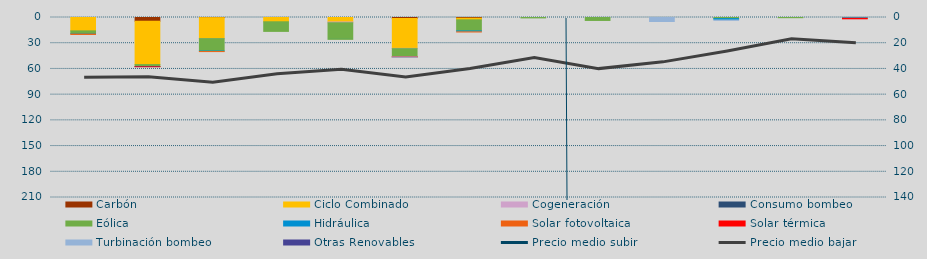
| Category | Carbón | Ciclo Combinado | Cogeneración | Consumo bombeo | Eólica | Hidráulica | Solar fotovoltaica | Solar térmica | Turbinación bombeo | Otras Renovables |
|---|---|---|---|---|---|---|---|---|---|---|
| 0 | 0 | 15599.6 | 0 |  | 3217.5 | 555 | 406.6 | 0 | 0 | 0 |
| 1 | 4394.5 | 50553 | 0 |  | 2251 | 0 | 33.2 | 196 | 0 | 467 |
| 2 | 167 | 24469.7 | 4.5 |  | 14472.2 | 627.8 | 21.8 | 0 | 0 | 0 |
| 3 | 0 | 4989.5 | 0 |  | 11218.3 | 8.9 | 0 | 0 | 0 | 0 |
| 4 | 0 | 5246.6 | 891.5 |  | 19357.7 | 73 | 0 | 0 | 0 | 0 |
| 5 | 1161 | 34847 | 340.9 |  | 9473.4 | 120 | 21.4 | 39.8 | 400 | 0 |
| 6 | 846 | 1898.8 | 0 |  | 12932.4 | 1173 | 33 | 0 | 0 | 80 |
| 7 | 0 | 0 | 0 |  | 464.6 | 0 | 0 | 0 | 0 | 0 |
| 8 | 0 | 0 | 0 |  | 3444.7 | 0 | 0 | 0 | 0 | 0 |
| 9 | 0 | 0 | 0 |  | 0 | 0 | 0 | 0 | 4657.9 | 0 |
| 10 | 0 | 0 | 0 |  | 1293.6 | 1910.2 | 0 | 0 | 100 | 0 |
| 11 | 0 | 0 | 0 |  | 227.5 | 0 | 0 | 0 | 0 | 0 |
| 12 | 0 | 0 | 0 |  | 0 | 946.5 | 61.6 | 516 | 0 | 0 |